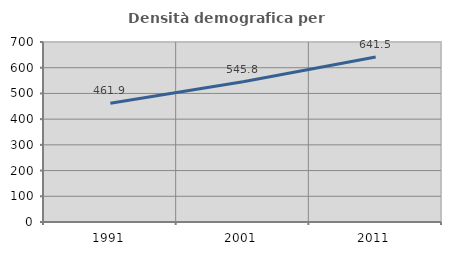
| Category | Densità demografica |
|---|---|
| 1991.0 | 461.95 |
| 2001.0 | 545.767 |
| 2011.0 | 641.5 |